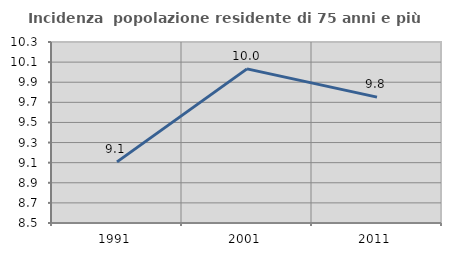
| Category | Incidenza  popolazione residente di 75 anni e più |
|---|---|
| 1991.0 | 9.108 |
| 2001.0 | 10.033 |
| 2011.0 | 9.752 |